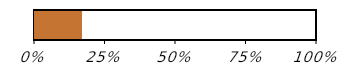
| Category | Ostmise edenemine (1 / 6) |
|---|---|
| Ostetud | 0.167 |